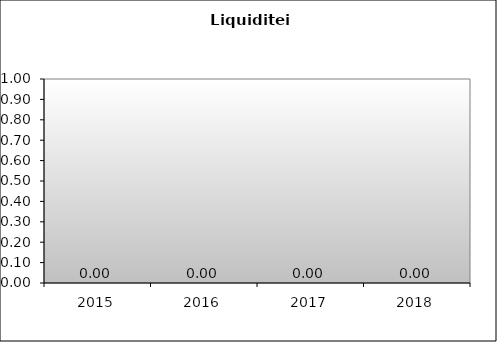
| Category | Series 0 |
|---|---|
| 2015.0 | 0 |
| 2016.0 | 0 |
| 2017.0 | 0 |
| 2018.0 | 0 |